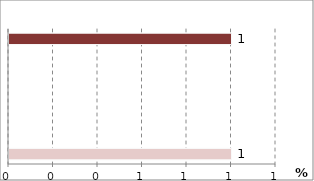
| Category | Series 8 | Series 7 | Series 6 | Series 5 | Series 4 | Series 3 | Series 2 | Series 1 | Series 0 |
|---|---|---|---|---|---|---|---|---|---|
| 0 | 1 |  |  |  |  |  |  |  | 1 |